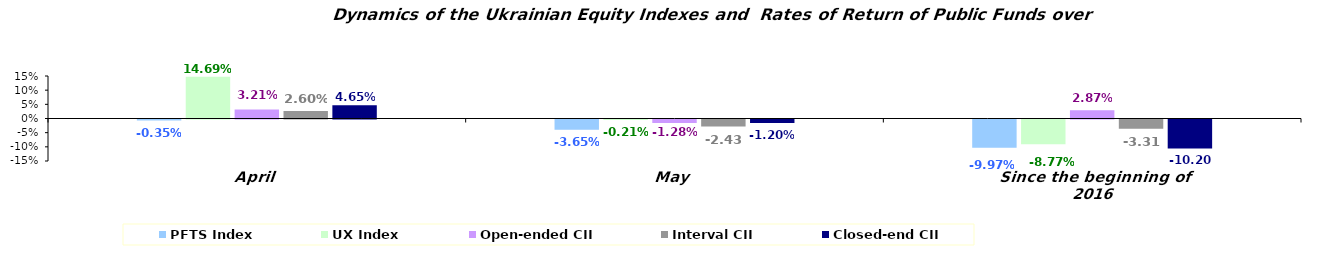
| Category | PFTS Index | UX Index | Open-ended CII | Interval CII | Closed-end CII |
|---|---|---|---|---|---|
| April | -0.004 | 0.147 | 0.032 | 0.026 | 0.047 |
| May | -0.036 | -0.002 | -0.013 | -0.024 | -0.012 |
| Since the beginning of 2016 | -0.1 | -0.088 | 0.029 | -0.033 | -0.102 |